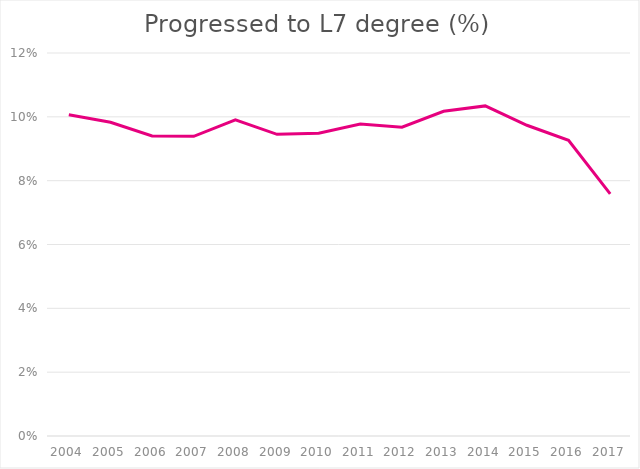
| Category | Percent progressing to geography degree |
|---|---|
| 2004.0 | 0.101 |
| 2005.0 | 0.098 |
| 2006.0 | 0.094 |
| 2007.0 | 0.094 |
| 2008.0 | 0.099 |
| 2009.0 | 0.095 |
| 2010.0 | 0.095 |
| 2011.0 | 0.098 |
| 2012.0 | 0.097 |
| 2013.0 | 0.102 |
| 2014.0 | 0.103 |
| 2015.0 | 0.097 |
| 2016.0 | 0.093 |
| 2017.0 | 0.076 |